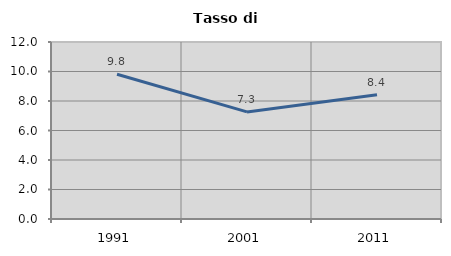
| Category | Tasso di disoccupazione   |
|---|---|
| 1991.0 | 9.813 |
| 2001.0 | 7.26 |
| 2011.0 | 8.418 |